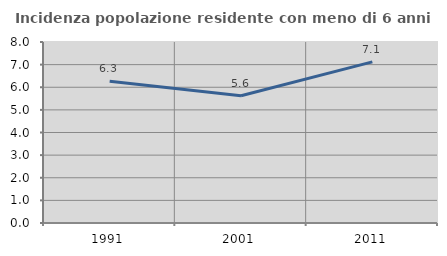
| Category | Incidenza popolazione residente con meno di 6 anni |
|---|---|
| 1991.0 | 6.262 |
| 2001.0 | 5.625 |
| 2011.0 | 7.122 |